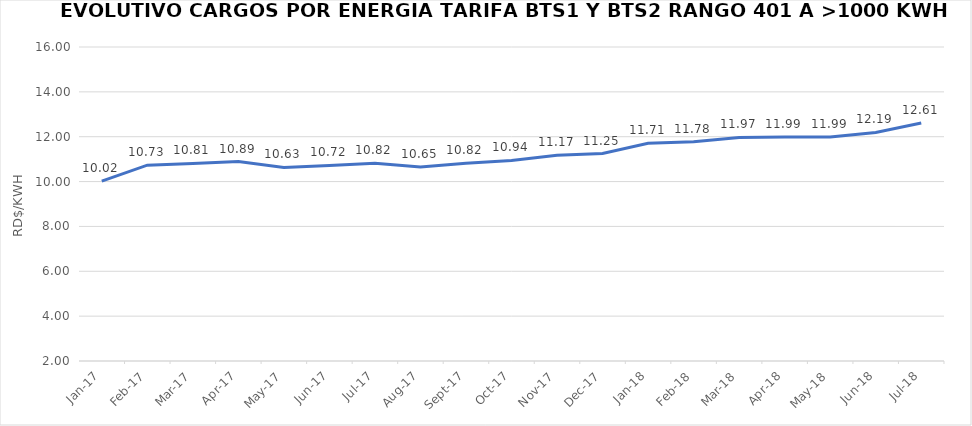
| Category | Series 0 |
|---|---|
| 2017-01-01 | 10.02 |
| 2017-02-01 | 10.73 |
| 2017-03-01 | 10.81 |
| 2017-04-01 | 10.89 |
| 2017-05-01 | 10.63 |
| 2017-06-01 | 10.72 |
| 2017-07-01 | 10.82 |
| 2017-08-01 | 10.65 |
| 2017-09-01 | 10.82 |
| 2017-10-01 | 10.94 |
| 2017-11-01 | 11.17 |
| 2017-12-01 | 11.25 |
| 2018-01-01 | 11.71 |
| 2018-02-01 | 11.78 |
| 2018-03-01 | 11.97 |
| 2018-04-01 | 11.99 |
| 2018-05-01 | 11.99 |
| 2018-06-01 | 12.19 |
| 2018-07-01 | 12.61 |